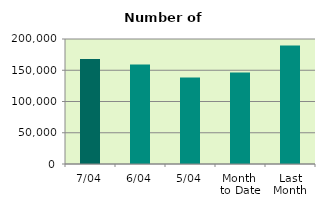
| Category | Series 0 |
|---|---|
| 7/04 | 167966 |
| 6/04 | 159210 |
| 5/04 | 138536 |
| Month 
to Date | 146539.2 |
| Last
Month | 189416.87 |